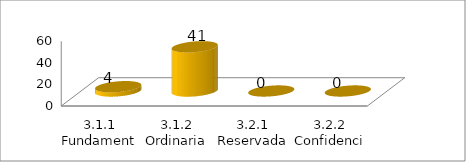
| Category | Series 0 |
|---|---|
| 3.1.1 Fundamental | 4 |
| 3.1.2 Ordinaria | 41 |
| 3.2.1 Reservada | 0 |
| 3.2.2 Confidencial | 0 |